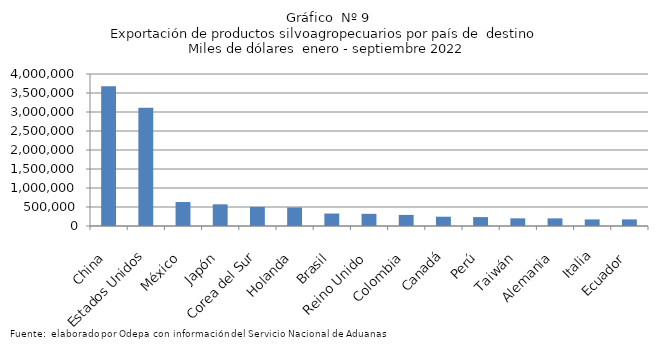
| Category | Series 0 |
|---|---|
| China | 3678664.456 |
| Estados Unidos | 3114306.445 |
| México | 630547.09 |
| Japón | 570909.227 |
| Corea del Sur | 504039.408 |
| Holanda | 487298.316 |
| Brasil | 328339.788 |
| Reino Unido | 320696.631 |
| Colombia | 291746.556 |
| Canadá | 244714.445 |
| Perú | 234626.748 |
| Taiwán | 201424.683 |
| Alemania | 200919.608 |
| Italia | 173552.496 |
| Ecuador | 173511.758 |